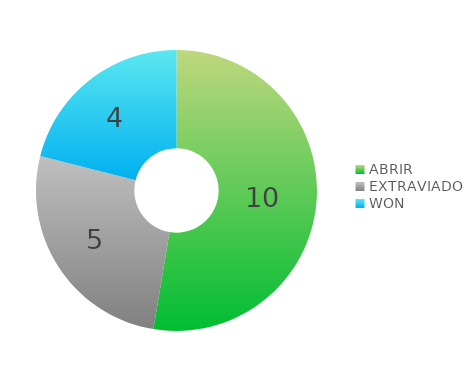
| Category | Series 0 |
|---|---|
| ABRIR | 10 |
| EXTRAVIADO | 5 |
| WON | 4 |